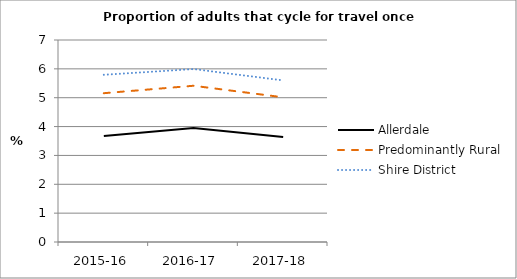
| Category | Allerdale | Predominantly Rural | Shire District |
|---|---|---|---|
| 2015-16 | 3.673 | 5.156 | 5.794 |
| 2016-17 | 3.954 | 5.414 | 5.993 |
| 2017-18 | 3.635 | 5.014 | 5.601 |